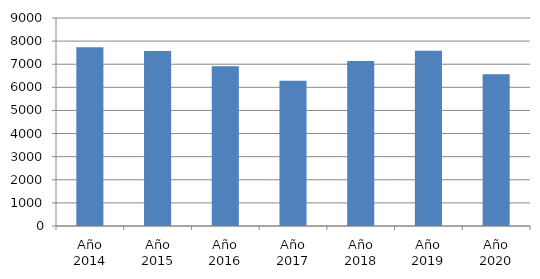
| Category | Series 0 |
|---|---|
| Año 2014 | 7736 |
| Año 2015 | 7573 |
| Año 2016 | 6913 |
| Año 2017 | 6284 |
| Año 2018 | 7140 |
| Año 2019 | 7580 |
| Año 2020 | 6566 |